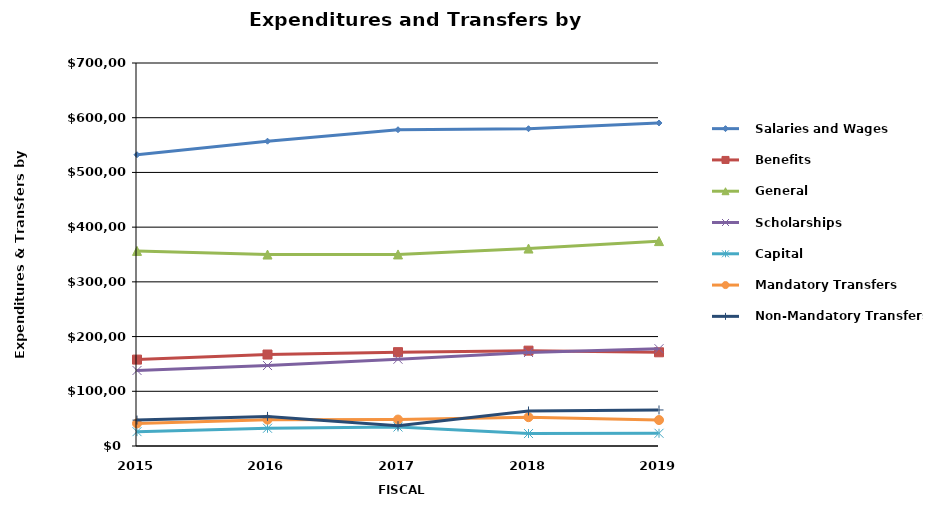
| Category |    Salaries and Wages |    Benefits |    General |    Scholarships |    Capital |    Mandatory Transfers |    Non-Mandatory Transfers |
|---|---|---|---|---|---|---|---|
| 2015.0 | 532320 | 157897 | 356611 | 138042 | 26219 | 41265 | 47371 |
| 2016.0 | 557075 | 167179 | 349927 | 147065 | 32429 | 48195 | 54128 |
| 2017.0 | 578049 | 171513 | 350126 | 158591 | 34696 | 48330 | 37088 |
| 2018.0 | 579886 | 174260 | 360879 | 170941 | 22788 | 52677 | 63971 |
| 2019.0 | 590372 | 171278 | 374490 | 177815 | 23236 | 47446 | 65872 |